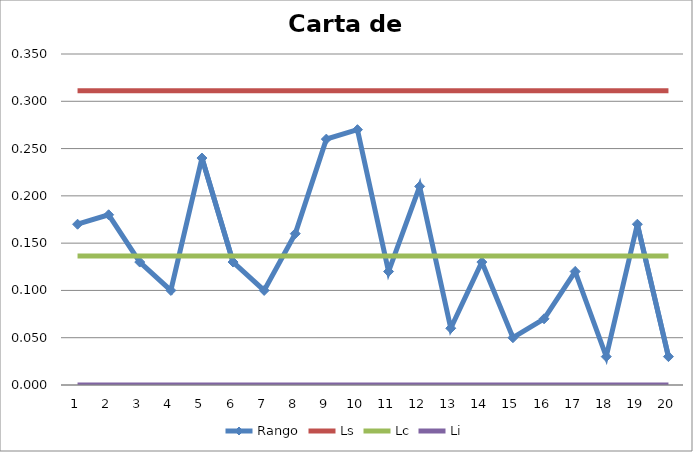
| Category | Rango | Ls | Lc | Li |
|---|---|---|---|---|
| 0 | 0.17 | 0.311 | 0.136 | 0 |
| 1 | 0.18 | 0.311 | 0.136 | 0 |
| 2 | 0.13 | 0.311 | 0.136 | 0 |
| 3 | 0.1 | 0.311 | 0.136 | 0 |
| 4 | 0.24 | 0.311 | 0.136 | 0 |
| 5 | 0.13 | 0.311 | 0.136 | 0 |
| 6 | 0.1 | 0.311 | 0.136 | 0 |
| 7 | 0.16 | 0.311 | 0.136 | 0 |
| 8 | 0.26 | 0.311 | 0.136 | 0 |
| 9 | 0.27 | 0.311 | 0.136 | 0 |
| 10 | 0.12 | 0.311 | 0.136 | 0 |
| 11 | 0.21 | 0.311 | 0.136 | 0 |
| 12 | 0.06 | 0.311 | 0.136 | 0 |
| 13 | 0.13 | 0.311 | 0.136 | 0 |
| 14 | 0.05 | 0.311 | 0.136 | 0 |
| 15 | 0.07 | 0.311 | 0.136 | 0 |
| 16 | 0.12 | 0.311 | 0.136 | 0 |
| 17 | 0.03 | 0.311 | 0.136 | 0 |
| 18 | 0.17 | 0.311 | 0.136 | 0 |
| 19 | 0.03 | 0.311 | 0.136 | 0 |